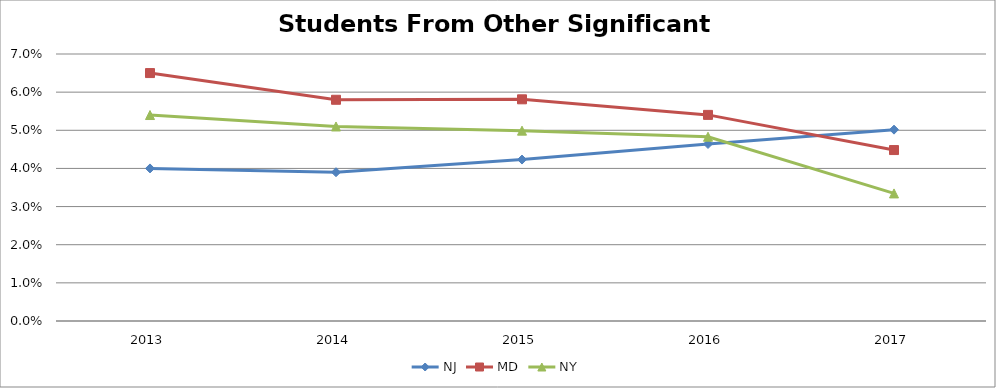
| Category | NJ | MD | NY |
|---|---|---|---|
| 2013.0 | 0.04 | 0.065 | 0.054 |
| 2014.0 | 0.039 | 0.058 | 0.051 |
| 2015.0 | 0.042 | 0.058 | 0.05 |
| 2016.0 | 0.046 | 0.054 | 0.048 |
| 2017.0 | 0.05 | 0.045 | 0.033 |